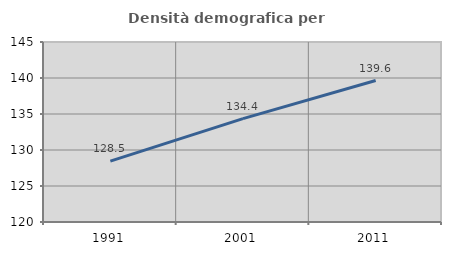
| Category | Densità demografica |
|---|---|
| 1991.0 | 128.46 |
| 2001.0 | 134.361 |
| 2011.0 | 139.645 |